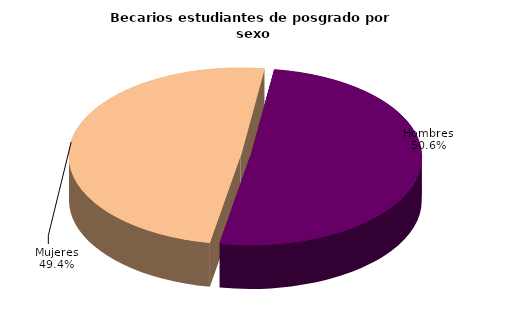
| Category | Series 0 |
|---|---|
| Hombres | 13630 |
| Mujeres | 13292 |